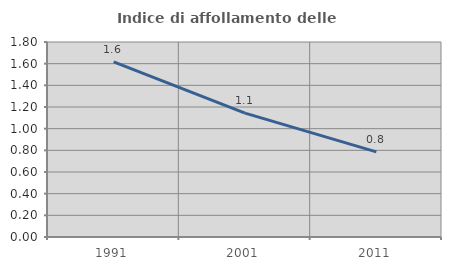
| Category | Indice di affollamento delle abitazioni  |
|---|---|
| 1991.0 | 1.617 |
| 2001.0 | 1.144 |
| 2011.0 | 0.785 |